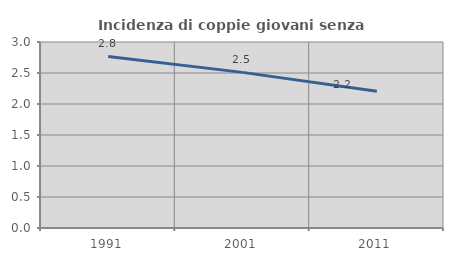
| Category | Incidenza di coppie giovani senza figli |
|---|---|
| 1991.0 | 2.767 |
| 2001.0 | 2.51 |
| 2011.0 | 2.206 |